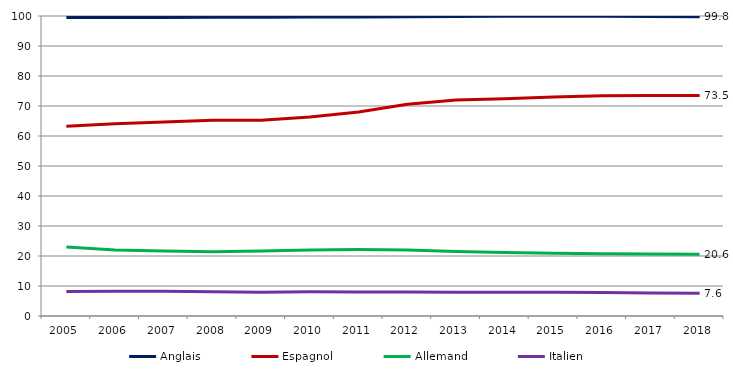
| Category | Anglais | Espagnol | Allemand | Italien |
|---|---|---|---|---|
| 2005 | 99.52 | 63.23 | 23.004 | 8.128 |
| 2006 | 99.509 | 64.115 | 22.004 | 8.236 |
| 2007 | 99.511 | 64.643 | 21.658 | 8.261 |
| 2008 | 99.574 | 65.23 | 21.435 | 8.106 |
| 2009 | 99.584 | 65.234 | 21.701 | 7.897 |
| 2010 | 99.658 | 66.308 | 22.01 | 8.042 |
| 2011 | 99.702 | 68.013 | 22.179 | 7.995 |
| 2012 | 99.791 | 70.587 | 22.035 | 8.001 |
| 2013 | 99.865 | 71.998 | 21.487 | 7.95 |
| 2014 | 99.882 | 72.405 | 21.129 | 7.911 |
| 2015 | 99.905 | 72.974 | 20.878 | 7.893 |
| 2016 | 99.91 | 73.404 | 20.752 | 7.802 |
| 2017 | 99.846 | 73.502 | 20.627 | 7.693 |
| 2018 | 99.767 | 73.51 | 20.569 | 7.6 |